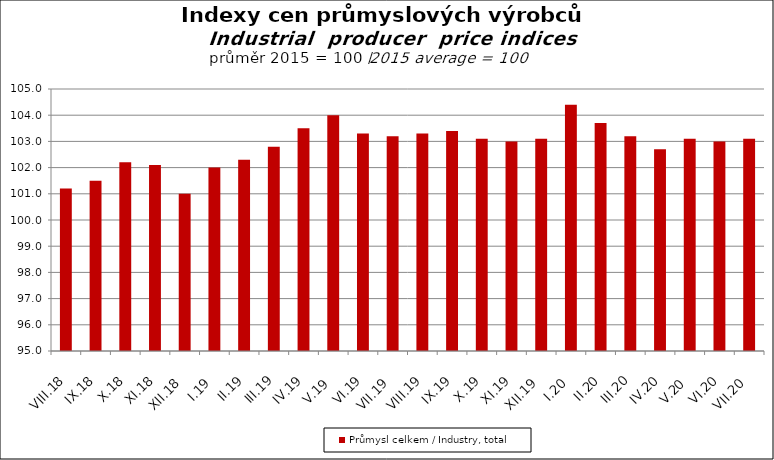
| Category | Průmysl celkem / Industry, total |
|---|---|
| VIII.18 | 101.2 |
| IX.18 | 101.5 |
| X.18 | 102.2 |
| XI.18 | 102.1 |
| XII.18 | 101 |
| I.19 | 102 |
| II.19 | 102.3 |
| III.19 | 102.8 |
| IV.19 | 103.5 |
| V.19 | 104 |
| VI.19 | 103.3 |
| VII.19 | 103.2 |
| VIII.19 | 103.3 |
| IX.19 | 103.4 |
| X.19 | 103.1 |
| XI.19 | 103 |
| XII.19 | 103.1 |
| I.20 | 104.4 |
| II.20 | 103.7 |
| III.20 | 103.2 |
| IV.20 | 102.7 |
| V.20 | 103.1 |
| VI.20 | 103 |
| VII.20 | 103.1 |